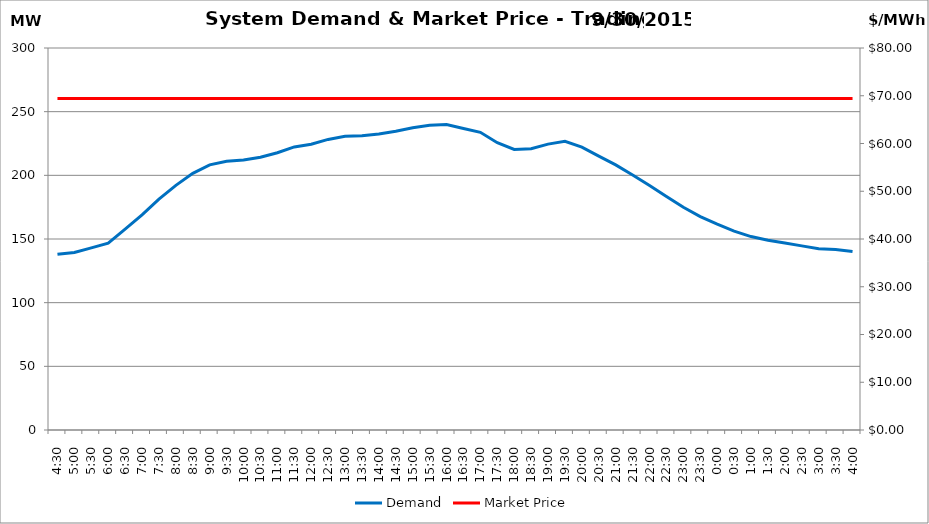
| Category | Demand |
|---|---|
| 0.1875 | 137.97 |
| 0.20833333333333334 | 139.46 |
| 0.22916666666666666 | 143 |
| 0.25 | 146.78 |
| 0.270833333333333 | 157.71 |
| 0.291666666666667 | 168.93 |
| 0.3125 | 181.35 |
| 0.333333333333333 | 192.14 |
| 0.354166666666667 | 201.52 |
| 0.375 | 208.25 |
| 0.395833333333333 | 211.04 |
| 0.416666666666667 | 212.02 |
| 0.4375 | 214.25 |
| 0.458333333333333 | 217.76 |
| 0.479166666666667 | 222.33 |
| 0.5 | 224.42 |
| 0.520833333333333 | 228.21 |
| 0.541666666666667 | 230.67 |
| 0.5625 | 231.05 |
| 0.583333333333333 | 232.52 |
| 0.604166666666667 | 234.57 |
| 0.625 | 237.37 |
| 0.645833333333334 | 239.27 |
| 0.666666666666667 | 239.84 |
| 0.6875 | 236.79 |
| 0.708333333333334 | 233.78 |
| 0.729166666666667 | 225.65 |
| 0.75 | 220.29 |
| 0.770833333333334 | 220.92 |
| 0.791666666666667 | 224.51 |
| 0.8125 | 226.7 |
| 0.833333333333334 | 222.12 |
| 0.854166666666667 | 215.08 |
| 0.875 | 208.18 |
| 0.895833333333334 | 200.23 |
| 0.916666666666667 | 192.09 |
| 0.9375 | 183.46 |
| 0.958333333333334 | 174.9 |
| 0.979166666666667 | 167.63 |
| 1900-01-01 | 161.64 |
| 1900-01-01 00:30:00 | 156.16 |
| 1900-01-01 01:00:00 | 151.92 |
| 1900-01-01 01:30:00 | 149.07 |
| 1900-01-01 02:00:00 | 146.88 |
| 1900-01-01 02:30:00 | 144.59 |
| 1900-01-01 03:00:00 | 142.38 |
| 1900-01-01 03:30:00 | 141.72 |
| 1900-01-01 04:00:00 | 140.24 |